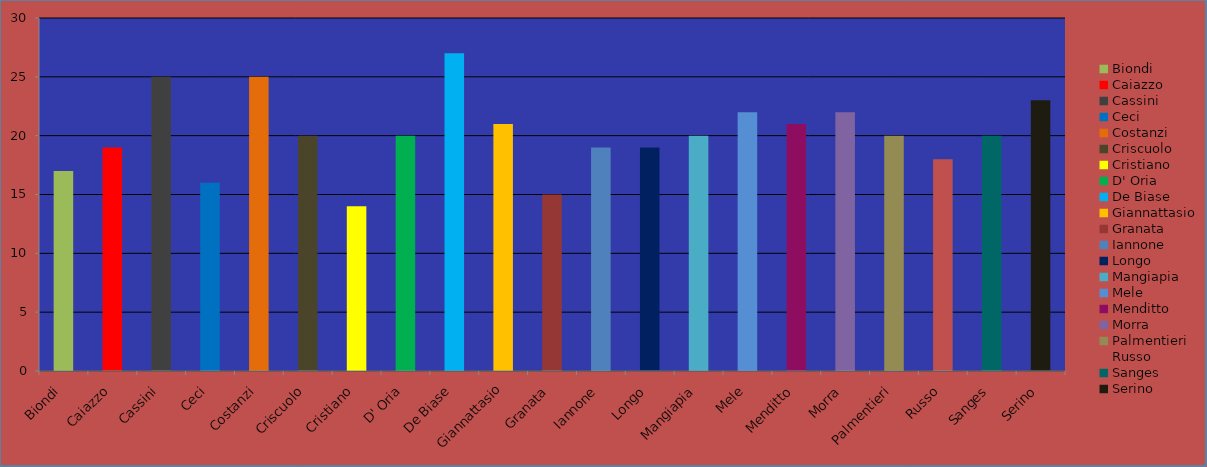
| Category | Series 0 |
|---|---|
| Biondi | 17 |
| Caiazzo | 19 |
| Cassini | 25 |
| Ceci | 16 |
| Costanzi | 25 |
| Criscuolo | 20 |
| Cristiano | 14 |
| D' Oria | 20 |
| De Biase | 27 |
| Giannattasio | 21 |
| Granata | 15 |
| Iannone | 19 |
| Longo | 19 |
| Mangiapia | 20 |
| Mele | 22 |
| Menditto | 21 |
| Morra | 22 |
| Palmentieri | 20 |
| Russo | 18 |
| Sanges | 20 |
| Serino | 23 |